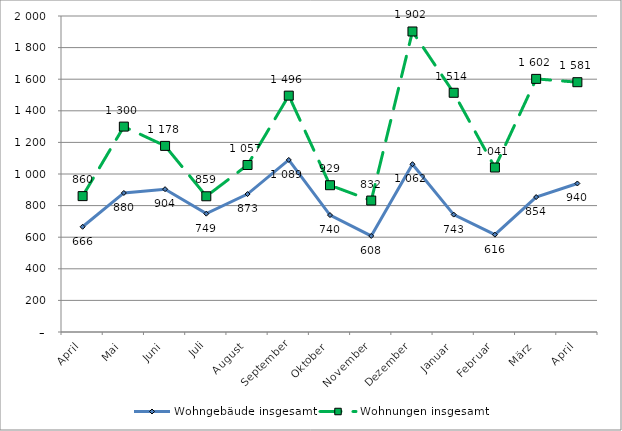
| Category | Wohngebäude insgesamt | Wohnungen insgesamt |
|---|---|---|
| April | 666 | 860 |
| Mai | 880 | 1300 |
| Juni | 904 | 1178 |
| Juli | 749 | 859 |
| August | 873 | 1057 |
| September | 1089 | 1496 |
| Oktober | 740 | 929 |
| November | 608 | 832 |
| Dezember | 1062 | 1902 |
| Januar | 743 | 1514 |
| Februar | 616 | 1041 |
| März | 854 | 1602 |
| April | 940 | 1581 |